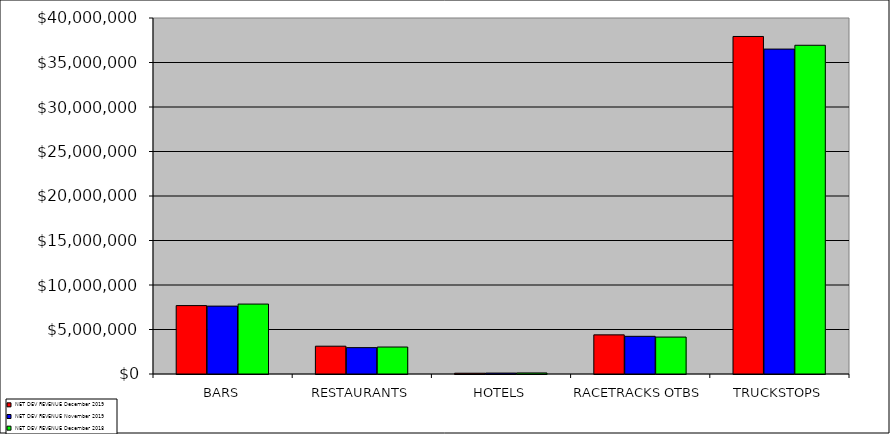
| Category | NET DEV REVENUE |
|---|---|
| BARS | 7857735 |
| RESTAURANTS | 3031193 |
| HOTELS | 120421 |
| RACETRACKS OTBS | 4149906 |
| TRUCKSTOPS | 36935282 |